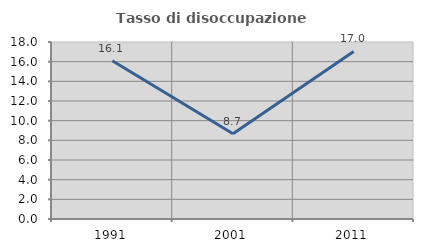
| Category | Tasso di disoccupazione giovanile  |
|---|---|
| 1991.0 | 16.091 |
| 2001.0 | 8.669 |
| 2011.0 | 17.043 |